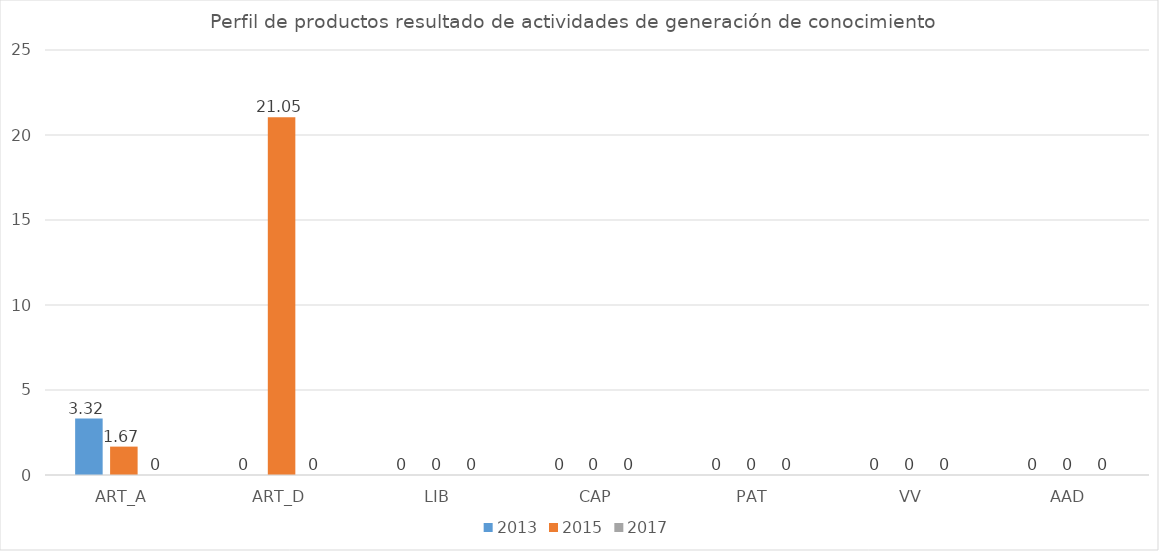
| Category | 2013 | 2015 | 2017 |
|---|---|---|---|
| ART_A | 3.32 | 1.67 | 0 |
| ART_D | 0 | 21.05 | 0 |
| LIB | 0 | 0 | 0 |
| CAP | 0 | 0 | 0 |
| PAT | 0 | 0 | 0 |
| VV | 0 | 0 | 0 |
| AAD | 0 | 0 | 0 |